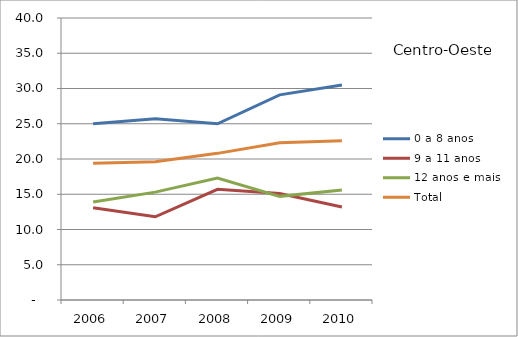
| Category | 0 a 8 anos | 9 a 11 anos | 12 anos e mais | Total |
|---|---|---|---|---|
| 2006.0 | 25 | 13.1 | 13.9 | 19.4 |
| 2007.0 | 25.7 | 11.8 | 15.3 | 19.6 |
| 2008.0 | 25 | 15.7 | 17.3 | 20.8 |
| 2009.0 | 29.1 | 15.1 | 14.7 | 22.3 |
| 2010.0 | 30.5 | 13.2 | 15.6 | 22.6 |